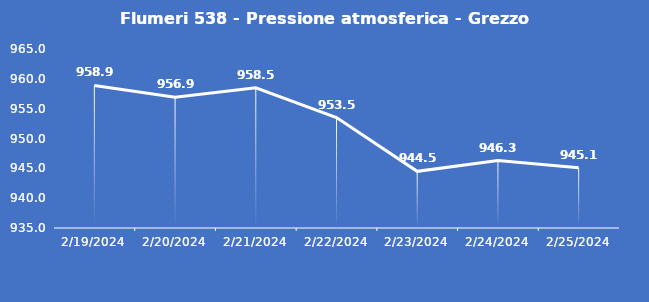
| Category | Flumeri 538 - Pressione atmosferica - Grezzo (hPa) |
|---|---|
| 2/19/24 | 958.9 |
| 2/20/24 | 956.9 |
| 2/21/24 | 958.5 |
| 2/22/24 | 953.5 |
| 2/23/24 | 944.5 |
| 2/24/24 | 946.3 |
| 2/25/24 | 945.1 |